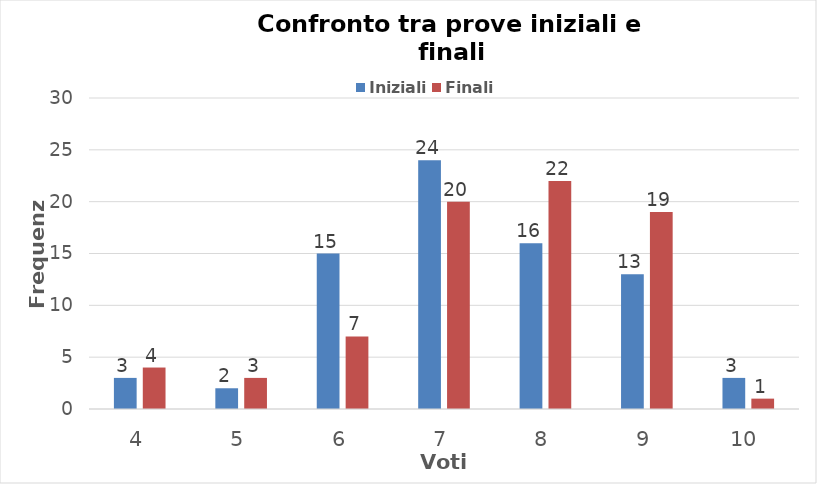
| Category | Iniziali | Finali |
|---|---|---|
| 4.0 | 3 | 4 |
| 5.0 | 2 | 3 |
| 6.0 | 15 | 7 |
| 7.0 | 24 | 20 |
| 8.0 | 16 | 22 |
| 9.0 | 13 | 19 |
| 10.0 | 3 | 1 |